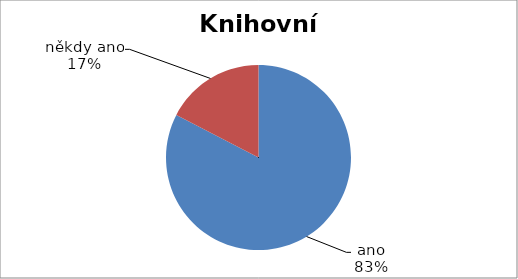
| Category | Celkem |
|---|---|
| ano | 19 |
| někdy ano, někdy ne | 4 |